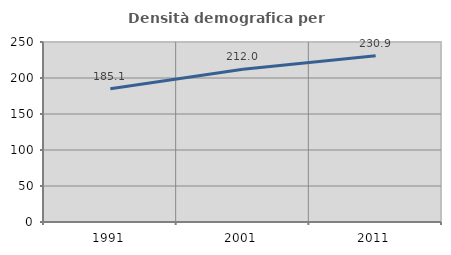
| Category | Densità demografica |
|---|---|
| 1991.0 | 185.094 |
| 2001.0 | 212.043 |
| 2011.0 | 230.889 |